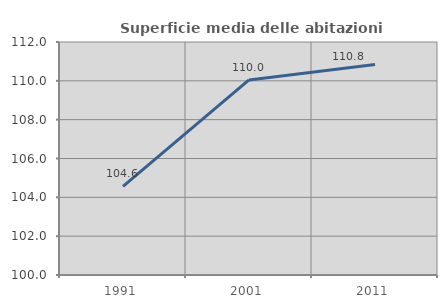
| Category | Superficie media delle abitazioni occupate |
|---|---|
| 1991.0 | 104.567 |
| 2001.0 | 110.048 |
| 2011.0 | 110.841 |